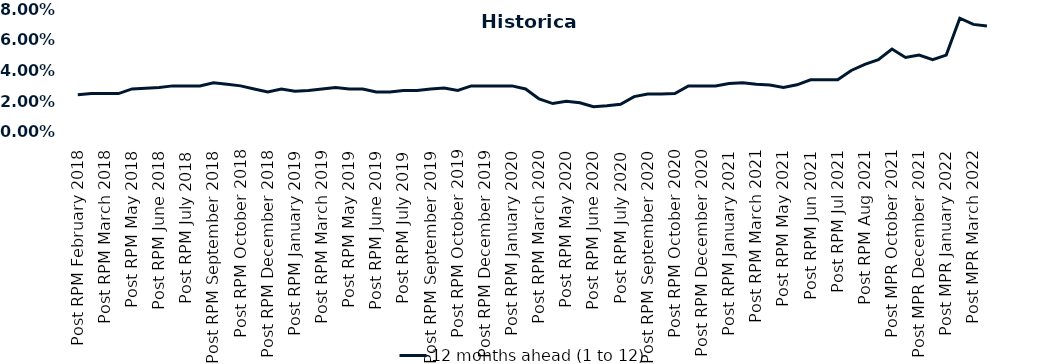
| Category | 12 months ahead (1 to 12)  |
|---|---|
| Post RPM February 2018 | 0.024 |
| Pre RPM March 2018 | 0.025 |
| Post RPM March 2018 | 0.025 |
| Pre RPM May 2018 | 0.025 |
| Post RPM May 2018 | 0.028 |
| Pre RPM June 2018 | 0.028 |
| Post RPM June 2018 | 0.029 |
| Pre RPM July 2018 | 0.03 |
| Post RPM July 2018 | 0.03 |
| Pre RPM September 2018 | 0.03 |
| Post RPM September 2018 | 0.032 |
| Pre RPM October 2018 | 0.031 |
| Post RPM October 2018 | 0.03 |
| Pre RPM December 2018 | 0.028 |
| Post RPM December 2018 | 0.026 |
| Pre RPM January 2019 | 0.028 |
| Post RPM January 2019 | 0.026 |
| Pre RPM March 2019 | 0.027 |
| Post RPM March 2019 | 0.028 |
| Pre RPM May 2019 | 0.029 |
| Post RPM May 2019 | 0.028 |
| Pre RPM June 2019 | 0.028 |
| Post RPM June 2019 | 0.026 |
| Pre RPM July 2019 | 0.026 |
| Post RPM July 2019 | 0.027 |
| Pre RPM September 2019 | 0.027 |
| Post RPM September 2019 | 0.028 |
| Pre RPM October 2019 | 0.029 |
| Post RPM October 2019 | 0.027 |
| Pre RPM December 2019 | 0.03 |
| Post RPM December 2019 | 0.03 |
| Pre RPM January 2020 | 0.03 |
| Post RPM January 2020 | 0.03 |
| Pre RPM March 2020 | 0.028 |
| Post RPM March 2020 | 0.022 |
| Pre RPM May 2020 | 0.018 |
| Post RPM May 2020 | 0.02 |
| Pre RPM June 2020 | 0.019 |
| Post RPM June 2020 | 0.016 |
| Pre RPM July 2020 | 0.017 |
| Post RPM July 2020 | 0.018 |
| Pre RPM September 2020 | 0.023 |
| Post RPM September 2020 | 0.025 |
| Pre RPM October 2020 | 0.025 |
| Post RPM October 2020 | 0.025 |
| Pre RPM December 2020 | 0.03 |
|  Post RPM December 2020 | 0.03 |
| Pre RPM January 2021 | 0.03 |
| Post RPM January 2021 | 0.032 |
|  Pre RPM March 2021 | 0.032 |
|  Post RPM March 2021 | 0.031 |
|  Pre RPM May 2021 | 0.03 |
|  Post RPM May 2021 | 0.029 |
|  Pre RPM Jun 2021 | 0.031 |
|   Post RPM Jun 2021 | 0.034 |
| Pre RPM Jul 2021 | 0.034 |
|  Post RPM Jul 2021 | 0.034 |
| Pre RPM Aug 2021 | 0.04 |
|  Post RPM Aug 2021 | 0.044 |
| Pre MPR October 2021 | 0.047 |
| Post MPR October 2021 | 0.054 |
| Pre MPR December 2021 | 0.048 |
| Post MPR December 2021 | 0.05 |
| Pre MPR January 2022 | 0.047 |
| Post MPR January 2022 | 0.05 |
| Pre MPR March 2022 | 0.074 |
| Post MPR March 2022 | 0.07 |
| Pre MPR May 2022 | 0.069 |